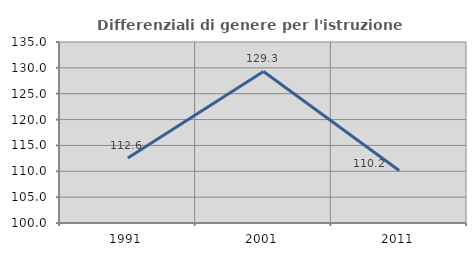
| Category | Differenziali di genere per l'istruzione superiore |
|---|---|
| 1991.0 | 112.57 |
| 2001.0 | 129.311 |
| 2011.0 | 110.156 |